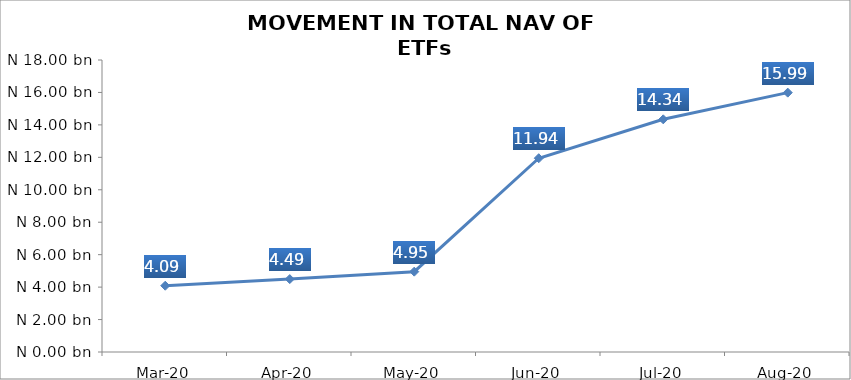
| Category | Series 0 |
|---|---|
| 2020-03-01 | 4085799334.74 |
| 2020-04-01 | 4494025633.23 |
| 2020-05-01 | 4952411842.71 |
| 2020-06-01 | 11944935776.22 |
| 2020-07-01 | 14343728259.45 |
| 2020-08-01 | 15987397591.7 |